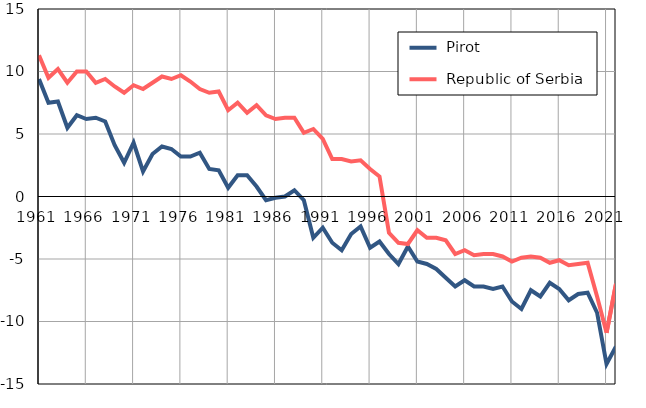
| Category |  Pirot |  Republic of Serbia |
|---|---|---|
| 1961.0 | 9.4 | 11.3 |
| 1962.0 | 7.5 | 9.5 |
| 1963.0 | 7.6 | 10.2 |
| 1964.0 | 5.5 | 9.1 |
| 1965.0 | 6.5 | 10 |
| 1966.0 | 6.2 | 10 |
| 1967.0 | 6.3 | 9.1 |
| 1968.0 | 6 | 9.4 |
| 1969.0 | 4.1 | 8.8 |
| 1970.0 | 2.7 | 8.3 |
| 1971.0 | 4.3 | 8.9 |
| 1972.0 | 2 | 8.6 |
| 1973.0 | 3.4 | 9.1 |
| 1974.0 | 4 | 9.6 |
| 1975.0 | 3.8 | 9.4 |
| 1976.0 | 3.2 | 9.7 |
| 1977.0 | 3.2 | 9.2 |
| 1978.0 | 3.5 | 8.6 |
| 1979.0 | 2.2 | 8.3 |
| 1980.0 | 2.1 | 8.4 |
| 1981.0 | 0.7 | 6.9 |
| 1982.0 | 1.7 | 7.5 |
| 1983.0 | 1.7 | 6.7 |
| 1984.0 | 0.8 | 7.3 |
| 1985.0 | -0.3 | 6.5 |
| 1986.0 | -0.1 | 6.2 |
| 1987.0 | 0 | 6.3 |
| 1988.0 | 0.5 | 6.3 |
| 1989.0 | -0.3 | 5.1 |
| 1990.0 | -3.3 | 5.4 |
| 1991.0 | -2.5 | 4.6 |
| 1992.0 | -3.7 | 3 |
| 1993.0 | -4.3 | 3 |
| 1994.0 | -3 | 2.8 |
| 1995.0 | -2.4 | 2.9 |
| 1996.0 | -4.1 | 2.2 |
| 1997.0 | -3.6 | 1.6 |
| 1998.0 | -4.6 | -2.9 |
| 1999.0 | -5.4 | -3.7 |
| 2000.0 | -4 | -3.8 |
| 2001.0 | -5.2 | -2.7 |
| 2002.0 | -5.4 | -3.3 |
| 2003.0 | -5.8 | -3.3 |
| 2004.0 | -6.5 | -3.5 |
| 2005.0 | -7.2 | -4.6 |
| 2006.0 | -6.7 | -4.3 |
| 2007.0 | -7.2 | -4.7 |
| 2008.0 | -7.2 | -4.6 |
| 2009.0 | -7.4 | -4.6 |
| 2010.0 | -7.2 | -4.8 |
| 2011.0 | -8.4 | -5.2 |
| 2012.0 | -9 | -4.9 |
| 2013.0 | -7.5 | -4.8 |
| 2014.0 | -8 | -4.9 |
| 2015.0 | -6.9 | -5.3 |
| 2016.0 | -7.4 | -5.1 |
| 2017.0 | -8.3 | -5.5 |
| 2018.0 | -7.8 | -5.4 |
| 2019.0 | -7.7 | -5.3 |
| 2020.0 | -9.3 | -8 |
| 2021.0 | -13.4 | -10.9 |
| 2022.0 | -12 | -7 |